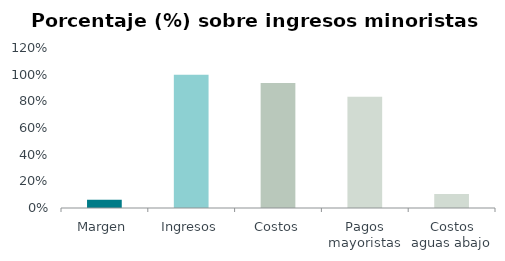
| Category | Series 0 |
|---|---|
| Margen | 0.062 |
| Ingresos | 1 |
| Costos | 0.938 |
| Pagos mayoristas | 0.833 |
| Costos aguas abajo | 0.104 |